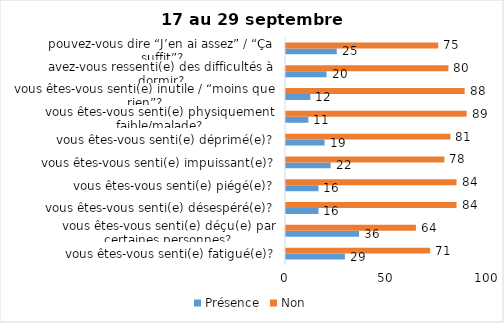
| Category | Présence | Non |
|---|---|---|
| vous êtes-vous senti(e) fatigué(e)? | 29 | 71 |
| vous êtes-vous senti(e) déçu(e) par certaines personnes? | 36 | 64 |
| vous êtes-vous senti(e) désespéré(e)? | 16 | 84 |
| vous êtes-vous senti(e) piégé(e)? | 16 | 84 |
| vous êtes-vous senti(e) impuissant(e)? | 22 | 78 |
| vous êtes-vous senti(e) déprimé(e)? | 19 | 81 |
| vous êtes-vous senti(e) physiquement faible/malade? | 11 | 89 |
| vous êtes-vous senti(e) inutile / “moins que rien”? | 12 | 88 |
| avez-vous ressenti(e) des difficultés à dormir? | 20 | 80 |
| pouvez-vous dire “J’en ai assez” / “Ça suffit”? | 25 | 75 |